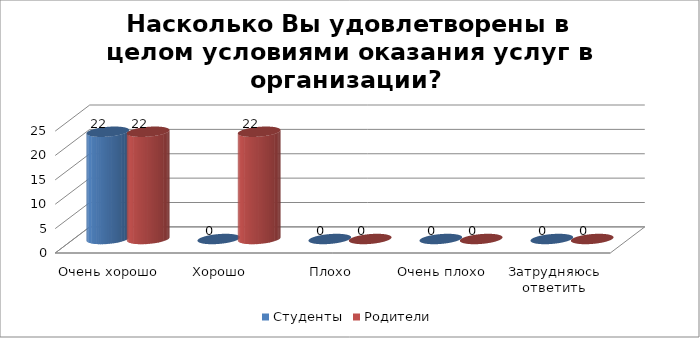
| Category | Студенты | Родители |
|---|---|---|
| Очень хорошо | 22 | 22 |
| Хорошо | 0 | 22 |
| Плохо | 0 | 0 |
| Очень плохо | 0 | 0 |
| Затрудняюсь ответить | 0 | 0 |